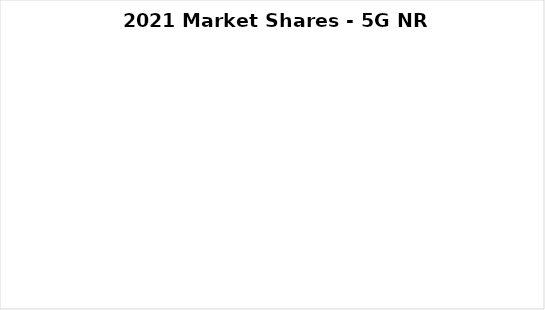
| Category | Series 0 |
|---|---|
| Ericsson | 0 |
| Fujitsu | 0 |
| Huawei | 0 |
| NEC | 0 |
| Nokia | 0 |
| Samsung | 0 |
| ZTE | 0 |
| Other | 0 |